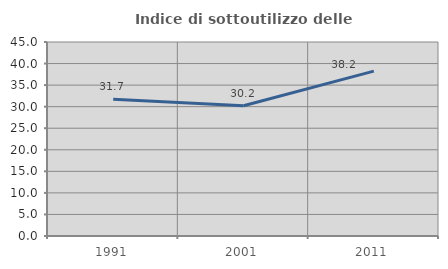
| Category | Indice di sottoutilizzo delle abitazioni  |
|---|---|
| 1991.0 | 31.72 |
| 2001.0 | 30.221 |
| 2011.0 | 38.245 |